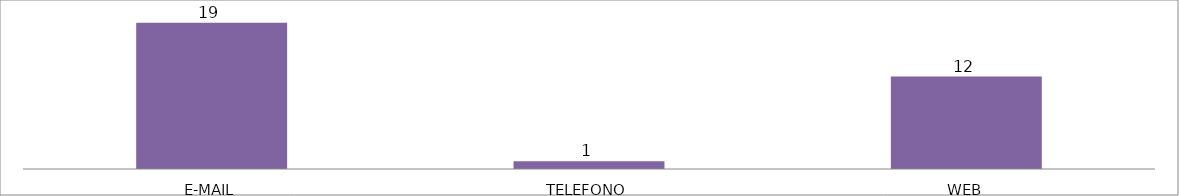
| Category | Series 0 |
|---|---|
| E-MAIL | 19 |
| TELEFONO | 1 |
| WEB | 12 |